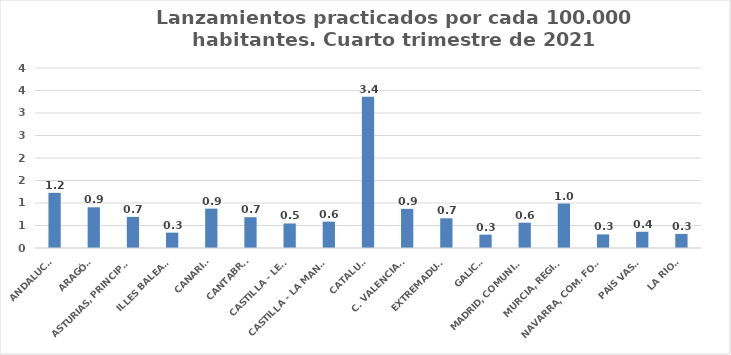
| Category | Series 0 |
|---|---|
| ANDALUCÍA | 1.227 |
| ARAGÓN | 0.905 |
| ASTURIAS, PRINCIPADO | 0.692 |
| ILLES BALEARS | 0.341 |
| CANARIAS | 0.874 |
| CANTABRIA | 0.684 |
| CASTILLA - LEÓN | 0.545 |
| CASTILLA - LA MANCHA | 0.585 |
| CATALUÑA | 3.362 |
| C. VALENCIANA | 0.87 |
| EXTREMADURA | 0.661 |
| GALICIA | 0.297 |
| MADRID, COMUNIDAD | 0.563 |
| MURCIA, REGIÓN | 0.988 |
| NAVARRA, COM. FORAL | 0.302 |
| PAÍS VASCO | 0.361 |
| LA RIOJA | 0.313 |